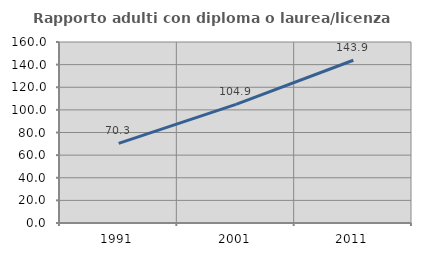
| Category | Rapporto adulti con diploma o laurea/licenza media  |
|---|---|
| 1991.0 | 70.325 |
| 2001.0 | 104.868 |
| 2011.0 | 143.871 |